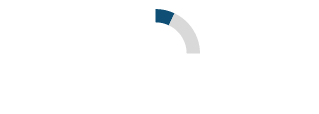
| Category | Series 0 |
|---|---|
| 0 | 0.07 |
| 1 | 0.18 |
| 2 | 0.75 |